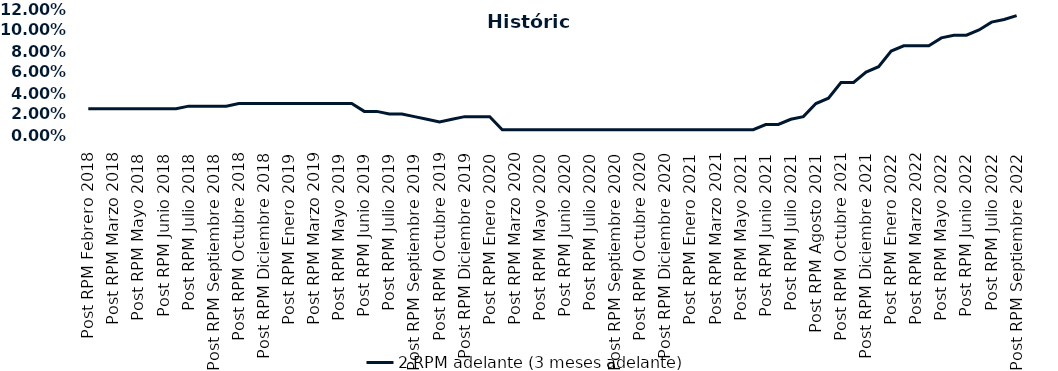
| Category | 2 RPM adelante (3 meses adelante) |
|---|---|
| Post RPM Febrero 2018 | 0.025 |
| Pre RPM Marzo 2018 | 0.025 |
| Post RPM Marzo 2018 | 0.025 |
| Pre RPM Mayo 2018 | 0.025 |
| Post RPM Mayo 2018 | 0.025 |
| Pre RPM Junio 2018 | 0.025 |
| Post RPM Junio 2018 | 0.025 |
| Pre RPM Julio 2018 | 0.025 |
| Post RPM Julio 2018 | 0.028 |
| Pre RPM Septiembre 2018 | 0.028 |
| Post RPM Septiembre 2018 | 0.028 |
| Pre RPM Octubre 2018 | 0.028 |
| Post RPM Octubre 2018 | 0.03 |
| Pre RPM Diciembre 2018 | 0.03 |
| Post RPM Diciembre 2018 | 0.03 |
| Pre RPM Enero 2019 | 0.03 |
| Post RPM Enero 2019 | 0.03 |
| Pre RPM Marzo 2019 | 0.03 |
| Post RPM Marzo 2019 | 0.03 |
| Pre RPM Mayo 2019 | 0.03 |
| Post RPM Mayo 2019 | 0.03 |
| Pre RPM Junio 2019 | 0.03 |
| Post RPM Junio 2019 | 0.022 |
| Pre RPM Julio 2019 | 0.022 |
| Post RPM Julio 2019 | 0.02 |
| Pre RPM Septiembre 2019 | 0.02 |
| Post RPM Septiembre 2019 | 0.018 |
| Pre RPM Octubre 2019 | 0.015 |
| Post RPM Octubre 2019 | 0.012 |
| Pre RPM Diciembre 2019 | 0.015 |
| Post RPM Diciembre 2019 | 0.018 |
| Pre RPM Enero 2020 | 0.018 |
| Post RPM Enero 2020 | 0.018 |
| Pre RPM Marzo 2020 | 0.005 |
| Post RPM Marzo 2020 | 0.005 |
| Pre RPM Mayo 2020 | 0.005 |
| Post RPM Mayo 2020 | 0.005 |
| Pre RPM Junio 2020 | 0.005 |
| Post RPM Junio 2020 | 0.005 |
| Pre RPM Julio 2020 | 0.005 |
| Post RPM Julio 2020 | 0.005 |
| Pre RPM Septiembre 2020 | 0.005 |
| Post RPM Septiembre 2020 | 0.005 |
| Pre RPM Octubre 2020 | 0.005 |
| Post RPM Octubre 2020 | 0.005 |
| Pre RPM Diciembre 2020 | 0.005 |
| Post RPM Diciembre 2020 | 0.005 |
| Pre RPM Enero 2021 | 0.005 |
| Post RPM Enero 2021 | 0.005 |
| Pre RPM Marzo 2021 | 0.005 |
| Post RPM Marzo 2021 | 0.005 |
| Pre RPM Mayo 2021 | 0.005 |
| Post RPM Mayo 2021 | 0.005 |
| Pre RPM Junio 2021 | 0.005 |
| Post RPM Junio 2021 | 0.01 |
| Pre RPM Julio 2021 | 0.01 |
| Post RPM Julio 2021 | 0.015 |
| Pre RPM Agosto 2021 | 0.018 |
| Post RPM Agosto 2021 | 0.03 |
| Pre RPM Octubre 2021 | 0.035 |
| Post RPM Octubre 2021 | 0.05 |
| Pre RPM Diciembre 2021 | 0.05 |
| Post RPM Diciembre 2021 | 0.06 |
| Pre RPM Enero 2022 | 0.065 |
| Post RPM Enero 2022 | 0.08 |
| Pre RPM Marzo 2022 | 0.085 |
| Post RPM Marzo 2022 | 0.085 |
| Pre RPM Mayo 2022 | 0.085 |
| Post RPM Mayo 2022 | 0.092 |
| Pre RPM Junio 2022 | 0.095 |
| Post RPM Junio 2022 | 0.095 |
| Pre RPM Julio 2022 | 0.1 |
| Post RPM Julio 2022 | 0.108 |
| Pre RPM Septiembre 2022 | 0.11 |
| Post RPM Septiembre 2022 | 0.114 |